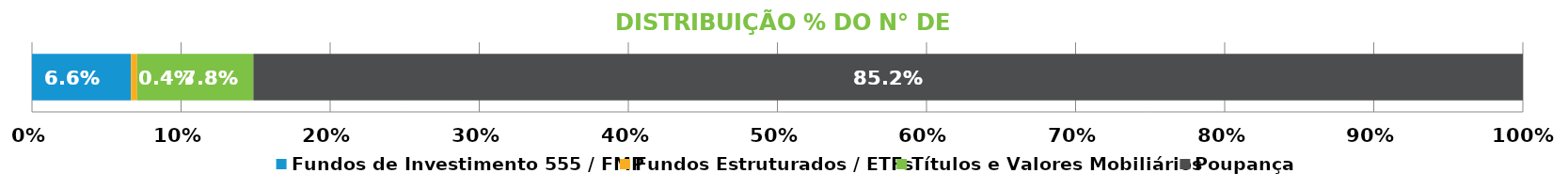
| Category | Fundos de Investimento 555 / FMP | Fundos Estruturados / ETFs | Títulos e Valores Mobiliários | Poupança |
|---|---|---|---|---|
| 0 | 0.066 | 0.004 | 0.078 | 0.852 |